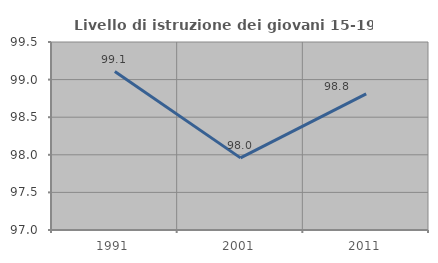
| Category | Livello di istruzione dei giovani 15-19 anni |
|---|---|
| 1991.0 | 99.107 |
| 2001.0 | 97.959 |
| 2011.0 | 98.81 |